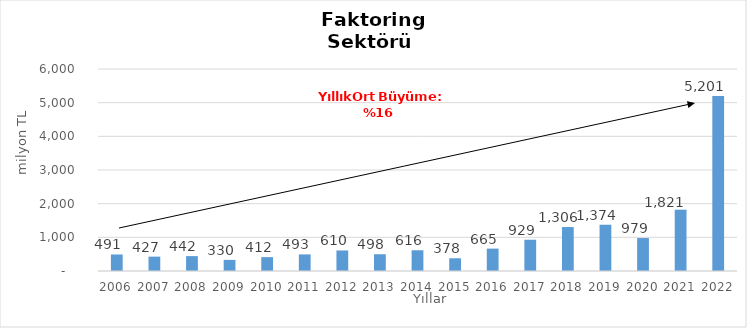
| Category | Faktoring  |
|---|---|
| 2006.0 | 490.834 |
| 2007.0 | 426.554 |
| 2008.0 | 442.315 |
| 2009.0 | 330.082 |
| 2010.0 | 412.077 |
| 2011.0 | 492.71 |
| 2012.0 | 610.081 |
| 2013.0 | 498.446 |
| 2014.0 | 616 |
| 2015.0 | 378 |
| 2016.0 | 665 |
| 2017.0 | 929 |
| 2018.0 | 1306 |
| 2019.0 | 1374 |
| 2020.0 | 979 |
| 2021.0 | 1821 |
| 2022.0 | 5201 |